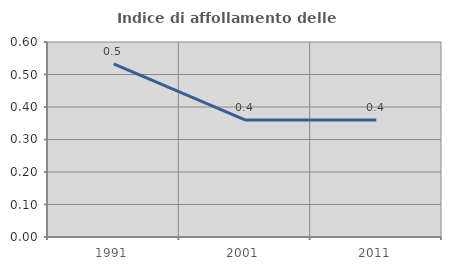
| Category | Indice di affollamento delle abitazioni  |
|---|---|
| 1991.0 | 0.533 |
| 2001.0 | 0.36 |
| 2011.0 | 0.36 |